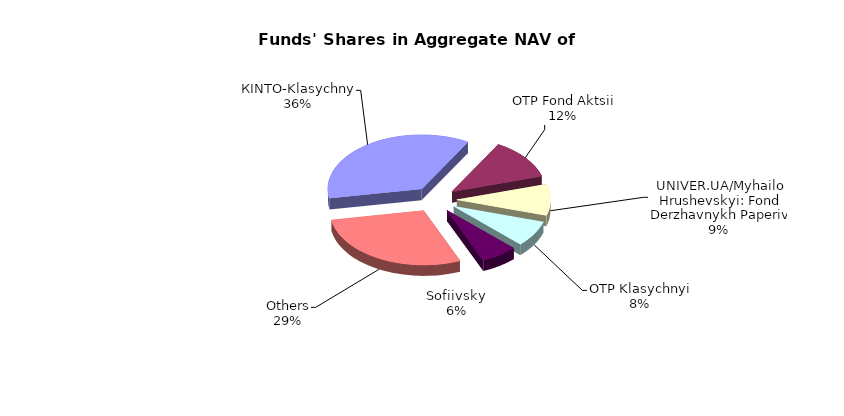
| Category | Series 0 | Series 1 |
|---|---|---|
| КІNТО-Klasychnyi | 29111024.36 | 0.36 |
| OTP Fond Aktsii | 9808588.61 | 0.121 |
| UNIVER.UA/Myhailo Hrushevskyi: Fond Derzhavnykh Paperiv | 7545286.55 | 0.093 |
| OTP Klasychnyi' | 6224926.47 | 0.077 |
| Sofiivskyi | 5082471.2 | 0.063 |
| Others | 23081164.2 | 0.285 |